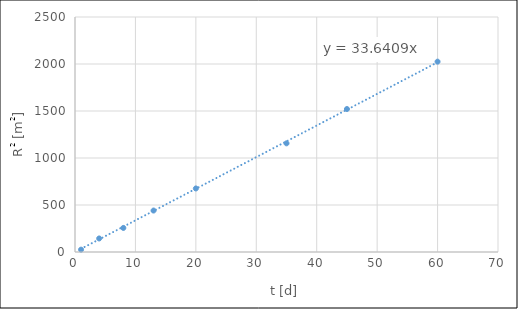
| Category | Rt2 |
|---|---|
| 1.0 | 25 |
| 4.0 | 144 |
| 8.0 | 256 |
| 13.0 | 441 |
| 20.0 | 676 |
| 35.0 | 1156 |
| 45.0 | 1521 |
| 60.0 | 2025 |